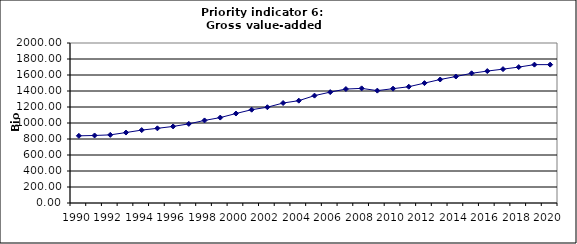
| Category | Gross value-added services, Bio Euro (EC95) |
|---|---|
| 1990 | 839.46 |
| 1991 | 843.993 |
| 1992 | 851.595 |
| 1993 | 880.476 |
| 1994 | 911.376 |
| 1995 | 933.295 |
| 1996 | 957.156 |
| 1997 | 989.021 |
| 1998 | 1032.137 |
| 1999 | 1067.728 |
| 2000 | 1118.447 |
| 2001 | 1166.342 |
| 2002 | 1197.246 |
| 2003 | 1249.748 |
| 2004 | 1279.192 |
| 2005 | 1342.13 |
| 2006 | 1385.979 |
| 2007 | 1424.246 |
| 2008 | 1432.825 |
| 2009 | 1404.526 |
| 2010 | 1429.283 |
| 2011 | 1453.468 |
| 2012 | 1498.615 |
| 2013 | 1543.676 |
| 2014 | 1581.047 |
| 2015 | 1621.175 |
| 2016 | 1649.17 |
| 2017 | 1673.36 |
| 2018 | 1698.842 |
| 2019 | 1729.583 |
| 2020 | 1729.583 |